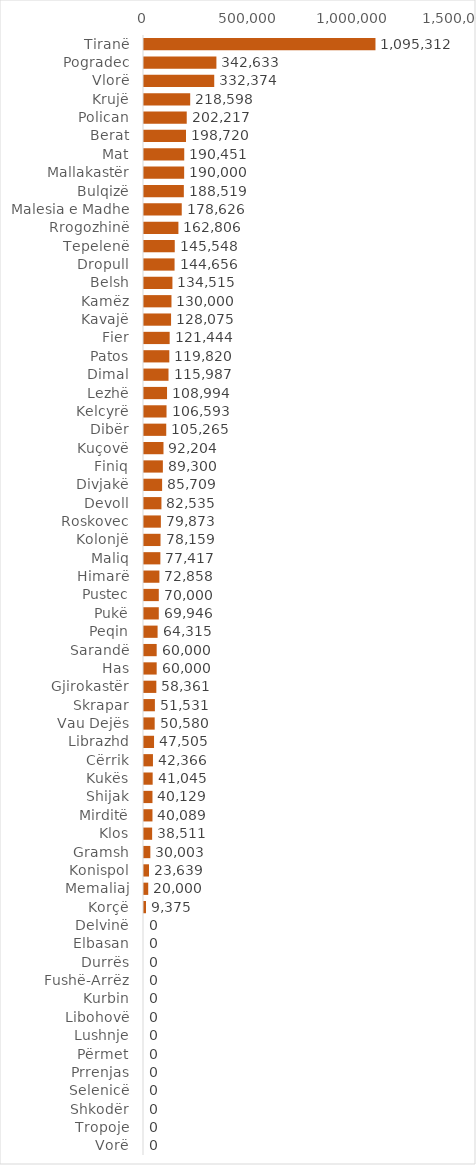
| Category | Parashikimi për v.2024 |
|---|---|
| Tiranë | 1095312 |
| Pogradec | 342633.478 |
| Vlorë | 332374.015 |
| Krujë | 218597.786 |
| Polican | 202216.941 |
| Berat | 198719.77 |
| Mat | 190450.85 |
| Mallakastër | 190000 |
| Bulqizë | 188519.251 |
| Malesia e Madhe | 178625.896 |
| Rrogozhinë | 162806.178 |
| Tepelenë | 145548.08 |
| Dropull | 144656.113 |
| Belsh | 134514.96 |
| Kamëz | 130000 |
| Kavajë | 128075.221 |
| Fier | 121444.473 |
| Patos | 119819.899 |
| Dimal | 115987.274 |
| Lezhë | 108993.533 |
| Kelcyrë | 106593.489 |
| Dibër | 105264.89 |
| Kuçovë | 92204.051 |
| Finiq | 89300.328 |
| Divjakë | 85709.137 |
| Devoll | 82535.283 |
| Roskovec | 79873.191 |
| Kolonjë | 78158.902 |
| Maliq | 77416.733 |
| Himarë | 72857.578 |
| Pustec | 70000 |
| Pukë | 69945.754 |
| Peqin | 64314.744 |
| Sarandë | 60000 |
| Has | 60000 |
| Gjirokastër | 58361.047 |
| Skrapar | 51531.42 |
| Vau Dejës | 50579.557 |
| Librazhd | 47504.834 |
| Cërrik | 42365.874 |
| Kukës | 41044.687 |
| Shijak | 40129.486 |
| Mirditë | 40088.936 |
| Klos | 38511.279 |
| Gramsh | 30002.955 |
| Konispol | 23638.642 |
| Memaliaj | 20000 |
| Korçë | 9375 |
| Delvinë | 0 |
| Elbasan | 0 |
| Durrës | 0 |
| Fushë-Arrëz | 0 |
| Kurbin | 0 |
| Libohovë | 0 |
| Lushnje | 0 |
| Përmet | 0 |
| Prrenjas | 0 |
| Selenicë | 0 |
| Shkodër | 0 |
| Tropoje | 0 |
| Vorë | 0 |